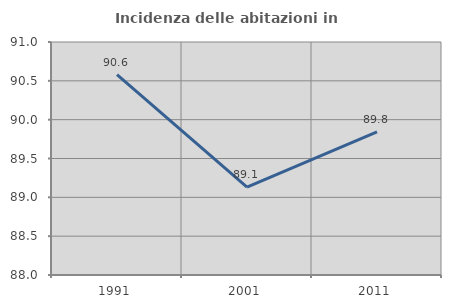
| Category | Incidenza delle abitazioni in proprietà  |
|---|---|
| 1991.0 | 90.58 |
| 2001.0 | 89.13 |
| 2011.0 | 89.844 |